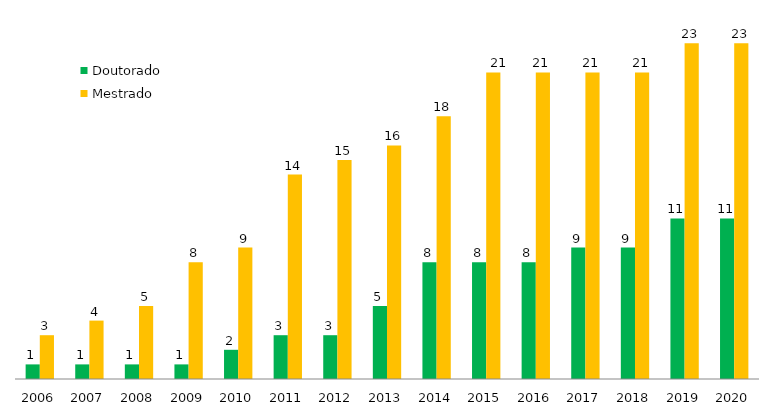
| Category | Doutorado | Mestrado |
|---|---|---|
| 2006.0 | 1 | 3 |
| 2007.0 | 1 | 4 |
| 2008.0 | 1 | 5 |
| 2009.0 | 1 | 8 |
| 2010.0 | 2 | 9 |
| 2011.0 | 3 | 14 |
| 2012.0 | 3 | 15 |
| 2013.0 | 5 | 16 |
| 2014.0 | 8 | 18 |
| 2015.0 | 8 | 21 |
| 2016.0 | 8 | 21 |
| 2017.0 | 9 | 21 |
| 2018.0 | 9 | 21 |
| 2019.0 | 11 | 23 |
| 2020.0 | 11 | 23 |